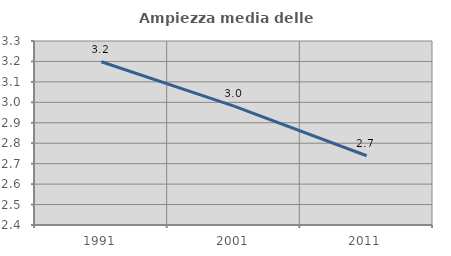
| Category | Ampiezza media delle famiglie |
|---|---|
| 1991.0 | 3.199 |
| 2001.0 | 2.981 |
| 2011.0 | 2.739 |